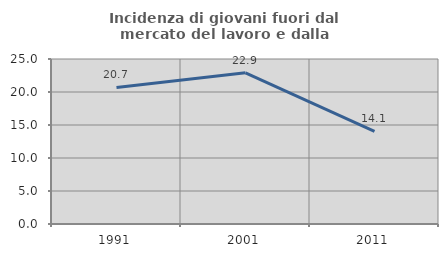
| Category | Incidenza di giovani fuori dal mercato del lavoro e dalla formazione  |
|---|---|
| 1991.0 | 20.691 |
| 2001.0 | 22.904 |
| 2011.0 | 14.05 |